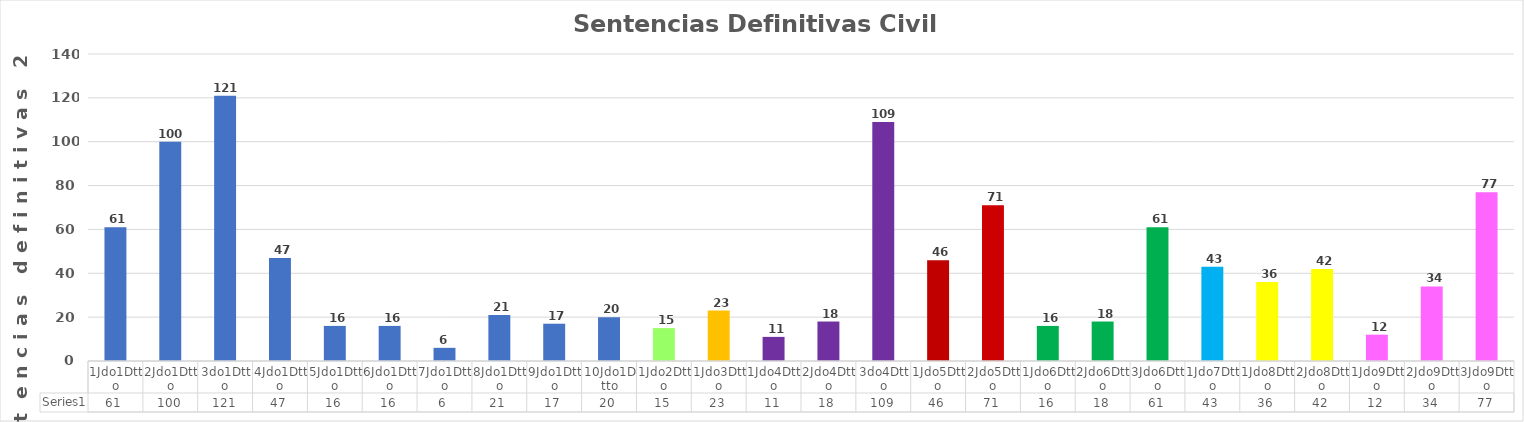
| Category | Series 0 |
|---|---|
| 1Jdo1Dtto | 61 |
| 2Jdo1Dtto | 100 |
| 3do1Dtto | 121 |
| 4Jdo1Dtto | 47 |
| 5Jdo1Dtto | 16 |
| 6Jdo1Dtto | 16 |
| 7Jdo1Dtto | 6 |
| 8Jdo1Dtto | 21 |
| 9Jdo1Dtto | 17 |
| 10Jdo1Dtto | 20 |
| 1Jdo2Dtto | 15 |
| 1Jdo3Dtto | 23 |
| 1Jdo4Dtto | 11 |
| 2Jdo4Dtto | 18 |
| 3do4Dtto | 109 |
| 1Jdo5Dtto | 46 |
| 2Jdo5Dtto | 71 |
| 1Jdo6Dtto | 16 |
| 2Jdo6Dtto | 18 |
| 3Jdo6Dtto | 61 |
| 1Jdo7Dtto | 43 |
| 1Jdo8Dtto | 36 |
| 2Jdo8Dtto | 42 |
| 1Jdo9Dtto | 12 |
| 2Jdo9Dtto | 34 |
| 3Jdo9Dtto | 77 |